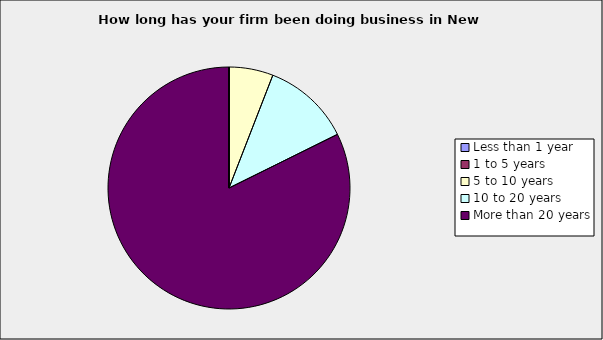
| Category | Series 0 |
|---|---|
| Less than 1 year | 0 |
| 1 to 5 years | 0 |
| 5 to 10 years | 0.059 |
| 10 to 20 years | 0.118 |
| More than 20 years | 0.824 |